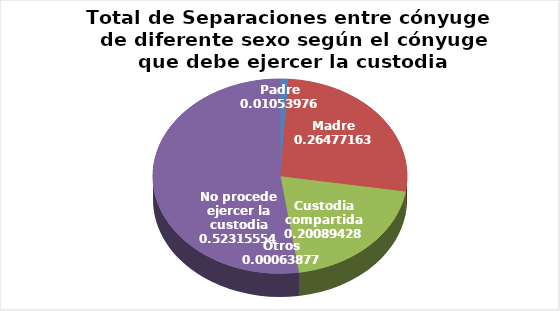
| Category | Series 0 |
|---|---|
| Padre | 33 |
| Madre | 829 |
| Custodia compartida | 629 |
| Otros | 2 |
| No procede ejercer la custodia | 1638 |